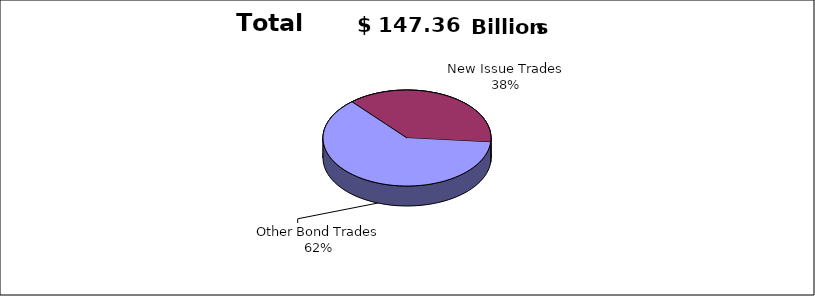
| Category | Series 0 |
|---|---|
| Other Bond Trades | 91721615189 |
| New Issue Trades | 55641081590 |